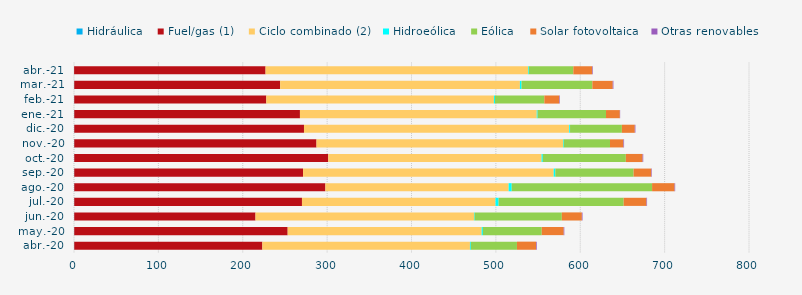
| Category | Hidráulica | Fuel/gas (1) | Ciclo combinado (2) | Hidroeólica | Eólica | Solar fotovoltaica | Otras renovables |
|---|---|---|---|---|---|---|---|
| abr.-20 | 0.288 | 222.936 | 246.048 | 0.991 | 54.729 | 22.649 | 0.84 |
| may.-20 | 0.288 | 252.958 | 229.929 | 1.443 | 69.75 | 26.044 | 0.706 |
| jun.-20 | 0.272 | 214.832 | 258.953 | 0.743 | 103.362 | 23.75 | 0.785 |
| jul.-20 | 0.29 | 269.887 | 229.388 | 3.652 | 148.255 | 27.015 | 0.694 |
| ago.-20 | 0.294 | 297.661 | 217.205 | 3.576 | 166.404 | 26.667 | 0.691 |
| sep.-20 | 0.292 | 271.163 | 297.078 | 1.912 | 92.772 | 20.952 | 0.65 |
| oct.-20 | 0.299 | 301.034 | 252.831 | 1.457 | 98.401 | 19.852 | 0.783 |
| nov.-20 | 0.285 | 287.125 | 292.221 | 0.822 | 54.805 | 15.933 | 0.743 |
| dic.-20 | 0.3 | 272.275 | 314.373 | 0.959 | 61.442 | 15.285 | 0.753 |
| ene.-21 | 0.298 | 267.491 | 280.66 | 0.993 | 81.105 | 16.368 | 0.359 |
| feb.-21 | 0.259 | 227.675 | 269.761 | 1.226 | 58.505 | 17.691 | 0.7 |
| mar.-21 | 0.282 | 244.022 | 284.196 | 1.921 | 83.922 | 24.173 | 0.792 |
| abr.-21 | 0.138 | 226.895 | 311.21 | 0.836 | 52.701 | 22.41 | 0.722 |